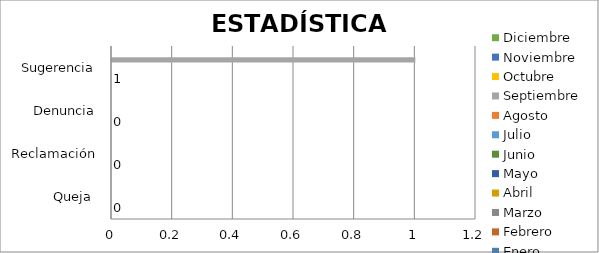
| Category | Enero | Febrero | Marzo | Abril | Mayo | Junio | Julio | Agosto | Septiembre | Octubre | Noviembre | Diciembre |
|---|---|---|---|---|---|---|---|---|---|---|---|---|
| Queja  | 0 | 0 | 0 | 0 | 0 | 0 | 0 | 0 | 0 | 0 | 0 | 0 |
| Reclamación | 0 | 0 | 0 | 0 | 0 | 0 | 0 | 0 | 0 | 0 | 0 | 0 |
| Denuncia | 0 | 0 | 0 | 0 | 0 | 0 | 0 | 0 | 0 | 0 | 0 | 0 |
| Sugerencia | 0 | 0 | 0 | 0 | 0 | 0 | 0 | 0 | 1 | 0 | 0 | 0 |